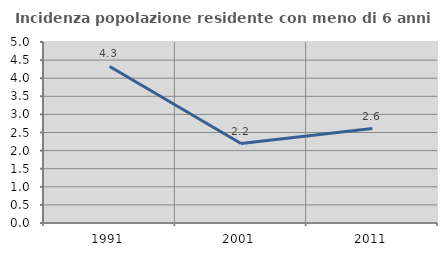
| Category | Incidenza popolazione residente con meno di 6 anni |
|---|---|
| 1991.0 | 4.324 |
| 2001.0 | 2.194 |
| 2011.0 | 2.609 |